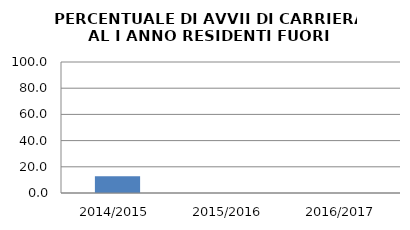
| Category | 2014/2015 2015/2016 2016/2017 |
|---|---|
| 2014/2015 | 12.821 |
| 2015/2016 | 0 |
| 2016/2017 | 0 |